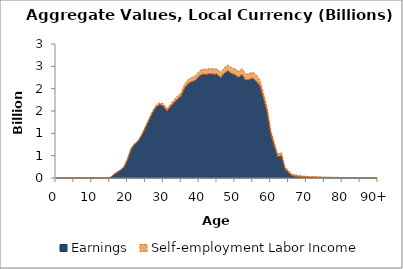
| Category | Earnings | Self-employment Labor Income |
|---|---|---|
| 0 | 0 | 0 |
|  | 0 | 0 |
| 2 | 0 | 0 |
| 3 | 0 | 0 |
| 4 | 0 | 0 |
| 5 | 0 | 0 |
| 6 | 0 | 0 |
| 7 | 0 | 0 |
| 8 | 0 | 0 |
| 9 | 0 | 0 |
| 10 | 0 | 0 |
| 11 | 0 | 0 |
| 12 | 0 | 0 |
| 13 | 0 | 0 |
| 14 | 0 | 0 |
| 15 | 0 | 0 |
| 16 | 65.853 | 2.518 |
| 17 | 122.611 | 3.021 |
| 18 | 173.317 | 4.272 |
| 19 | 243.039 | 5.991 |
| 20 | 414.032 | 6.002 |
| 21 | 651.162 | 7.416 |
| 22 | 760.362 | 10.592 |
| 23 | 828.99 | 12.633 |
| 24 | 962.621 | 15.676 |
| 25 | 1129.372 | 20.421 |
| 26 | 1298.318 | 24.688 |
| 27 | 1462.435 | 32.081 |
| 28 | 1589.788 | 36.808 |
| 29 | 1643.565 | 42.426 |
| 30 | 1612.394 | 44.722 |
| 31 | 1500.877 | 44.913 |
| 32 | 1599.275 | 51.556 |
| 33 | 1687.44 | 58.976 |
| 34 | 1771.058 | 65.512 |
| 35 | 1842.43 | 71.191 |
| 36 | 2020.14 | 81.765 |
| 37 | 2115.098 | 93.707 |
| 38 | 2156.212 | 95.333 |
| 39 | 2188.11 | 101.357 |
| 40 | 2277.79 | 106.992 |
| 41 | 2324.457 | 113.601 |
| 42 | 2318.109 | 111.348 |
| 43 | 2333.949 | 114.838 |
| 44 | 2325.08 | 117.985 |
| 45 | 2321.562 | 116.606 |
| 46 | 2245.21 | 119.34 |
| 47 | 2341.196 | 120.693 |
| 48 | 2402.297 | 126.773 |
| 49 | 2343.608 | 125.825 |
| 50 | 2311.675 | 130.831 |
| 51 | 2255.534 | 130.719 |
| 52 | 2315.151 | 130.928 |
| 53 | 2190.58 | 131.343 |
| 54 | 2205.929 | 131.942 |
| 55 | 2233.758 | 135.866 |
| 56 | 2164.35 | 134.704 |
| 57 | 2064.806 | 123.934 |
| 58 | 1778.144 | 117.837 |
| 59 | 1481.316 | 99.77 |
| 60 | 998.844 | 81.544 |
| 61 | 719.35 | 69.804 |
| 62 | 472.701 | 52.509 |
| 63 | 503.31 | 68.624 |
| 64 | 204.748 | 39.991 |
| 65 | 121.808 | 40.941 |
| 66 | 49.365 | 32.991 |
| 67 | 38.696 | 27.5 |
| 68 | 28.667 | 23.802 |
| 69 | 21.811 | 19.807 |
| 70 | 18.818 | 17.065 |
| 71 | 15.068 | 13.252 |
| 72 | 14.203 | 14.602 |
| 73 | 12.442 | 13.071 |
| 74 | 11.445 | 13.028 |
| 75 | 10.632 | 11.18 |
| 76 | 9.066 | 10.878 |
| 77 | 7.695 | 9.142 |
| 78 | 6.813 | 8.331 |
| 79 | 6.416 | 6.906 |
| 80 | 5.541 | 6.292 |
| 81 | 4.6 | 6.246 |
| 82 | 3.937 | 4.615 |
| 83 | 3.858 | 4.377 |
| 84 | 3.087 | 3.952 |
| 85 | 2.103 | 2.256 |
| 86 | 2.019 | 2.286 |
| 87 | 1.665 | 1.973 |
| 88 | 1.397 | 1.416 |
| 89 | 1.108 | 1.262 |
| 90+ | 3.476 | 3.454 |